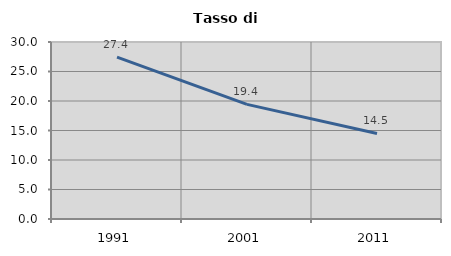
| Category | Tasso di disoccupazione   |
|---|---|
| 1991.0 | 27.424 |
| 2001.0 | 19.427 |
| 2011.0 | 14.505 |